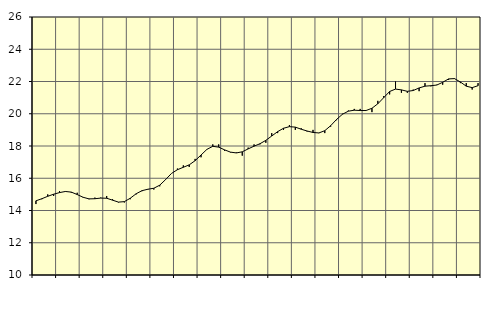
| Category | Piggar | Finansiell verksamhet, företagstjänster, SNI 64-82 |
|---|---|---|
| nan | 14.4 | 14.6 |
| 1.0 | 14.7 | 14.73 |
| 1.0 | 15 | 14.88 |
| 1.0 | 14.9 | 15.01 |
| nan | 15.2 | 15.11 |
| 2.0 | 15.2 | 15.18 |
| 2.0 | 15.1 | 15.14 |
| 2.0 | 15.1 | 14.99 |
| nan | 14.8 | 14.82 |
| 3.0 | 14.7 | 14.72 |
| 3.0 | 14.8 | 14.73 |
| 3.0 | 14.8 | 14.77 |
| nan | 14.9 | 14.76 |
| 4.0 | 14.7 | 14.64 |
| 4.0 | 14.5 | 14.52 |
| 4.0 | 14.5 | 14.55 |
| nan | 14.7 | 14.76 |
| 5.0 | 15 | 15.04 |
| 5.0 | 15.2 | 15.23 |
| 5.0 | 15.3 | 15.32 |
| nan | 15.3 | 15.38 |
| 6.0 | 15.5 | 15.57 |
| 6.0 | 15.9 | 15.92 |
| 6.0 | 16.3 | 16.3 |
| nan | 16.6 | 16.53 |
| 7.0 | 16.8 | 16.68 |
| 7.0 | 16.7 | 16.83 |
| 7.0 | 17.2 | 17.09 |
| nan | 17.3 | 17.44 |
| 8.0 | 17.8 | 17.79 |
| 8.0 | 18.1 | 17.98 |
| 8.0 | 18.1 | 17.93 |
| nan | 17.7 | 17.76 |
| 9.0 | 17.6 | 17.62 |
| 9.0 | 17.6 | 17.57 |
| 9.0 | 17.4 | 17.64 |
| nan | 17.9 | 17.82 |
| 10.0 | 18.1 | 17.99 |
| 10.0 | 18.1 | 18.14 |
| 10.0 | 18.2 | 18.35 |
| nan | 18.8 | 18.62 |
| 11.0 | 18.8 | 18.89 |
| 11.0 | 19 | 19.1 |
| 11.0 | 19.3 | 19.2 |
| nan | 19 | 19.17 |
| 12.0 | 19.1 | 19.04 |
| 12.0 | 18.9 | 18.93 |
| 12.0 | 19 | 18.84 |
| nan | 18.8 | 18.81 |
| 13.0 | 18.8 | 18.95 |
| 13.0 | 19.2 | 19.26 |
| 13.0 | 19.6 | 19.65 |
| nan | 20 | 19.97 |
| 14.0 | 20.2 | 20.16 |
| 14.0 | 20.3 | 20.22 |
| 14.0 | 20.3 | 20.2 |
| nan | 20.2 | 20.2 |
| 15.0 | 20.1 | 20.34 |
| 15.0 | 20.8 | 20.62 |
| 15.0 | 21.1 | 21 |
| nan | 21.2 | 21.38 |
| 16.0 | 22 | 21.53 |
| 16.0 | 21.3 | 21.48 |
| 16.0 | 21.3 | 21.39 |
| nan | 21.5 | 21.44 |
| 17.0 | 21.4 | 21.6 |
| 17.0 | 21.9 | 21.71 |
| 17.0 | 21.7 | 21.74 |
| nan | 21.8 | 21.78 |
| 18.0 | 21.8 | 21.95 |
| 18.0 | 22.1 | 22.16 |
| 18.0 | 22.2 | 22.18 |
| nan | 21.9 | 21.97 |
| 19.0 | 21.9 | 21.71 |
| 19.0 | 21.5 | 21.62 |
| 19.0 | 21.9 | 21.74 |